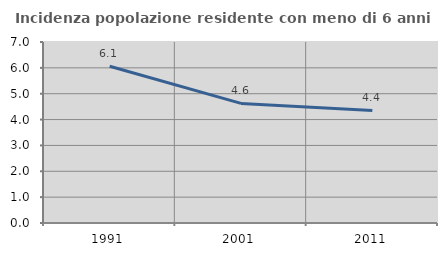
| Category | Incidenza popolazione residente con meno di 6 anni |
|---|---|
| 1991.0 | 6.064 |
| 2001.0 | 4.625 |
| 2011.0 | 4.353 |